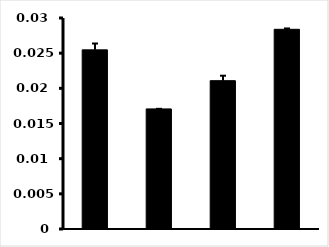
| Category | Series 0 |
|---|---|
| 0 | 0.025 |
| 1 | 0.017 |
| 2 | 0.021 |
| 3 | 0.028 |